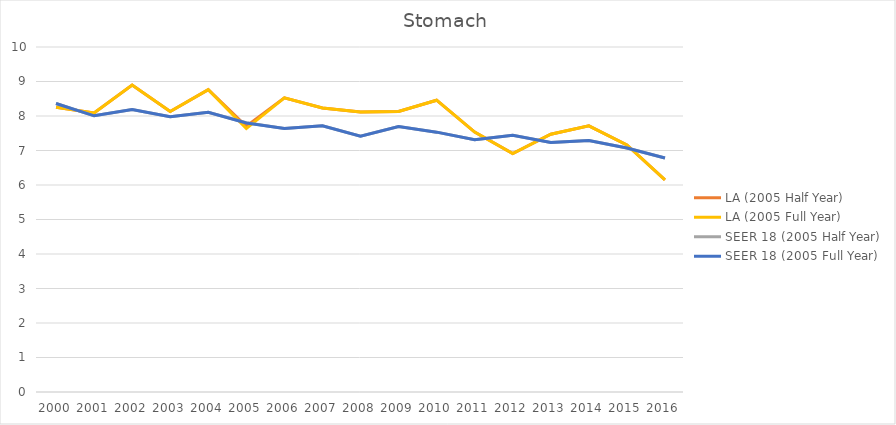
| Category | LA (2005 Half Year) | LA (2005 Full Year) | SEER 18 (2005 Half Year) | SEER 18 (2005 Full Year) |
|---|---|---|---|---|
| 2000.0 | 8.256 | 8.256 | 8.363 | 8.363 |
| 2001.0 | 8.087 | 8.087 | 8.005 | 8.005 |
| 2002.0 | 8.899 | 8.899 | 8.19 | 8.19 |
| 2003.0 | 8.132 | 8.132 | 7.98 | 7.98 |
| 2004.0 | 8.763 | 8.763 | 8.106 | 8.106 |
| 2005.0 | 7.704 | 7.635 | 7.804 | 7.798 |
| 2006.0 | 8.524 | 8.524 | 7.64 | 7.64 |
| 2007.0 | 8.233 | 8.233 | 7.717 | 7.717 |
| 2008.0 | 8.118 | 8.118 | 7.417 | 7.417 |
| 2009.0 | 8.131 | 8.131 | 7.692 | 7.692 |
| 2010.0 | 8.458 | 8.458 | 7.532 | 7.532 |
| 2011.0 | 7.534 | 7.534 | 7.31 | 7.31 |
| 2012.0 | 6.911 | 6.911 | 7.439 | 7.439 |
| 2013.0 | 7.473 | 7.473 | 7.23 | 7.23 |
| 2014.0 | 7.716 | 7.716 | 7.291 | 7.291 |
| 2015.0 | 7.161 | 7.161 | 7.07 | 7.07 |
| 2016.0 | 6.15 | 6.15 | 6.781 | 6.781 |